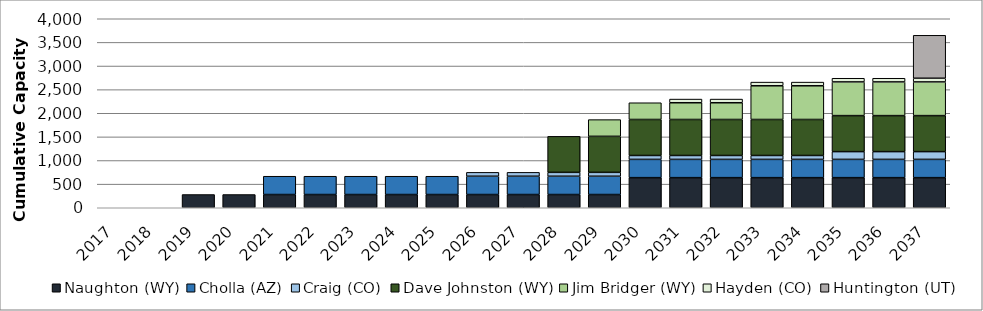
| Category | Naughton (WY) | Cholla (AZ) | Craig (CO) | Dave Johnston (WY) | Jim Bridger (WY) | Hayden (CO) | Huntington (UT) |
|---|---|---|---|---|---|---|---|
| 2017.0 | 0 | 0 | 0 | 0 | 0 | 0 | 0 |
| 2018.0 | 0 | 0 | 0 | 0 | 0 | 0 | 0 |
| 2019.0 | 280 | 0 | 0 | 0 | 0 | 0 | 0 |
| 2020.0 | 280 | 0 | 0 | 0 | 0 | 0 | 0 |
| 2021.0 | 280 | 387 | 0 | 0 | 0 | 0 | 0 |
| 2022.0 | 280 | 387 | 0 | 0 | 0 | 0 | 0 |
| 2023.0 | 280 | 387 | 0 | 0 | 0 | 0 | 0 |
| 2024.0 | 280 | 387 | 0 | 0 | 0 | 0 | 0 |
| 2025.0 | 280 | 387 | 0 | 0 | 0 | 0 | 0 |
| 2026.0 | 280 | 387 | 82.3 | 0 | 0 | 0 | 0 |
| 2027.0 | 280 | 387 | 82.3 | 0 | 0 | 0 | 0 |
| 2028.0 | 280 | 387 | 82.3 | 762 | 0 | 0 | 0 |
| 2029.0 | 280 | 387 | 82.3 | 762 | 354 | 0 | 0 |
| 2030.0 | 637 | 387 | 82.3 | 762 | 354 | 0 | 0 |
| 2031.0 | 637 | 387 | 82.3 | 762 | 354 | 77.78 | 0 |
| 2032.0 | 637 | 387 | 82.3 | 762 | 354 | 77.78 | 0 |
| 2033.0 | 637 | 387 | 82.3 | 762 | 713.3 | 77.78 | 0 |
| 2034.0 | 637 | 387 | 82.3 | 762 | 713.3 | 77.78 | 0 |
| 2035.0 | 637 | 387 | 163.84 | 762 | 713.3 | 77.78 | 0 |
| 2036.0 | 637 | 387 | 163.84 | 762 | 713.3 | 77.78 | 0 |
| 2037.0 | 637 | 387 | 163.84 | 762 | 713.3 | 77.78 | 909 |